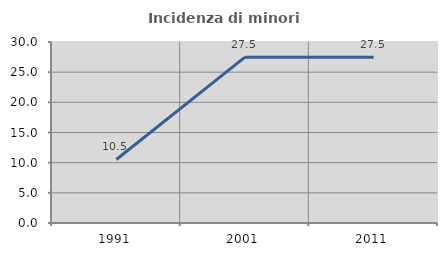
| Category | Incidenza di minori stranieri |
|---|---|
| 1991.0 | 10.526 |
| 2001.0 | 27.485 |
| 2011.0 | 27.464 |